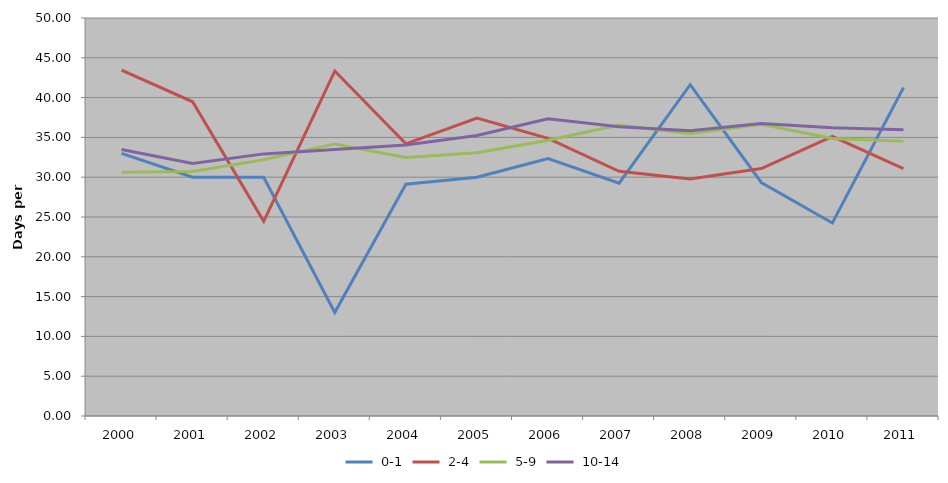
| Category |  0-1 |  2-4 |  5-9 |  10-14 |
|---|---|---|---|---|
| 2000 | 33 | 43.458 | 30.624 | 33.483 |
| 2001 | 30 | 39.474 | 30.715 | 31.719 |
| 2002 | 30 | 24.455 | 32.195 | 32.93 |
| 2003 | 13 | 43.333 | 34.182 | 33.483 |
| 2004 | 29.125 | 34.195 | 32.481 | 34.051 |
| 2005 | 30 | 37.422 | 33.062 | 35.247 |
| 2006 | 32.348 | 34.881 | 34.653 | 37.334 |
| 2007 | 29.25 | 30.747 | 36.553 | 36.333 |
| 2008 | 41.615 | 29.768 | 35.468 | 35.827 |
| 2009 | 29.333 | 31.083 | 36.658 | 36.754 |
| 2010 | 24.25 | 35.116 | 34.854 | 36.221 |
| 2011 | 41.25 | 31.073 | 34.527 | 35.969 |